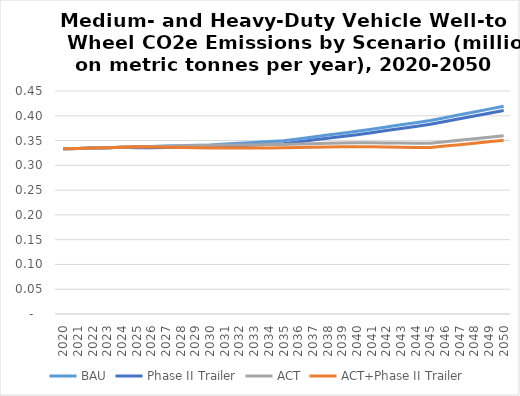
| Category | BAU | Phase II Trailer | ACT | ACT+Phase II Trailer |
|---|---|---|---|---|
| 2020.0 | 0.333 | 0.333 | 0.333 | 0.333 |
| 2021.0 | 0.334 | 0.334 | 0.334 | 0.334 |
| 2022.0 | 0.335 | 0.335 | 0.335 | 0.335 |
| 2023.0 | 0.336 | 0.336 | 0.336 | 0.336 |
| 2024.0 | 0.337 | 0.337 | 0.337 | 0.337 |
| 2025.0 | 0.337 | 0.335 | 0.337 | 0.337 |
| 2026.0 | 0.338 | 0.336 | 0.338 | 0.337 |
| 2027.0 | 0.339 | 0.336 | 0.339 | 0.336 |
| 2028.0 | 0.34 | 0.336 | 0.339 | 0.336 |
| 2029.0 | 0.34 | 0.336 | 0.34 | 0.335 |
| 2030.0 | 0.341 | 0.337 | 0.341 | 0.335 |
| 2031.0 | 0.343 | 0.338 | 0.341 | 0.335 |
| 2032.0 | 0.345 | 0.339 | 0.341 | 0.335 |
| 2033.0 | 0.346 | 0.341 | 0.342 | 0.335 |
| 2034.0 | 0.348 | 0.342 | 0.342 | 0.335 |
| 2035.0 | 0.35 | 0.344 | 0.342 | 0.335 |
| 2036.0 | 0.353 | 0.347 | 0.343 | 0.336 |
| 2037.0 | 0.357 | 0.351 | 0.344 | 0.336 |
| 2038.0 | 0.361 | 0.355 | 0.344 | 0.337 |
| 2039.0 | 0.365 | 0.358 | 0.345 | 0.337 |
| 2040.0 | 0.369 | 0.362 | 0.346 | 0.338 |
| 2041.0 | 0.373 | 0.366 | 0.345 | 0.337 |
| 2042.0 | 0.377 | 0.37 | 0.345 | 0.337 |
| 2043.0 | 0.382 | 0.374 | 0.345 | 0.337 |
| 2044.0 | 0.386 | 0.379 | 0.345 | 0.336 |
| 2045.0 | 0.39 | 0.383 | 0.344 | 0.336 |
| 2046.0 | 0.396 | 0.388 | 0.347 | 0.339 |
| 2047.0 | 0.402 | 0.394 | 0.35 | 0.342 |
| 2048.0 | 0.408 | 0.4 | 0.354 | 0.345 |
| 2049.0 | 0.413 | 0.405 | 0.357 | 0.348 |
| 2050.0 | 0.419 | 0.411 | 0.36 | 0.351 |